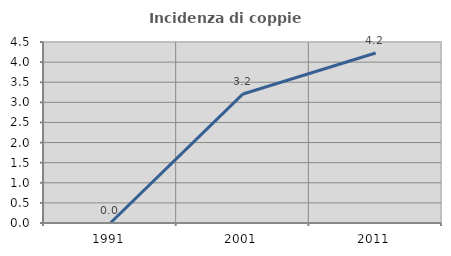
| Category | Incidenza di coppie miste |
|---|---|
| 1991.0 | 0 |
| 2001.0 | 3.209 |
| 2011.0 | 4.225 |